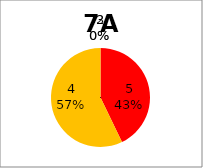
| Category | Series 0 |
|---|---|
| 5.0 | 3 |
| 4.0 | 4 |
| 3.0 | 0 |
| 2.0 | 0 |